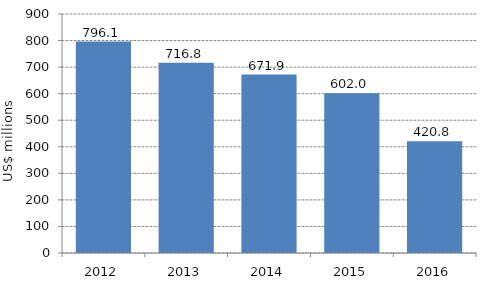
| Category | Series 0 |
|---|---|
| 2012.0 | 796.064 |
| 2013.0 | 716.796 |
| 2014.0 | 671.867 |
| 2015.0 | 602.032 |
| 2016.0 | 420.847 |